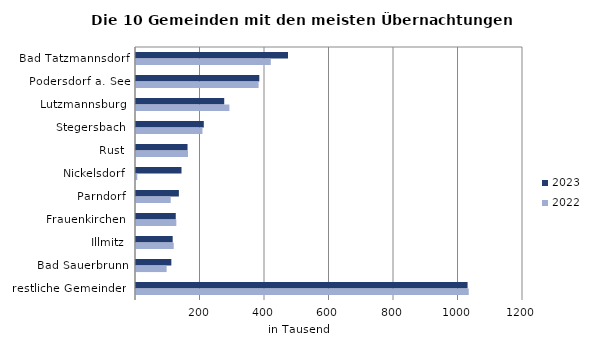
| Category | 2023 | 2022 |
|---|---|---|
| Bad Tatzmannsdorf | 471334 | 417994 |
| Podersdorf a. See | 382356 | 380185 |
| Lutzmannsburg | 273587 | 289608 |
| Stegersbach | 210259 | 206066 |
| Rust | 159813 | 161211 |
| Nickelsdorf | 141094 | 3971 |
| Parndorf | 132982 | 107616 |
| Frauenkirchen | 123295 | 125028 |
| Illmitz | 113764 | 116953 |
| Bad Sauerbrunn | 109591 | 95003 |
| restliche Gemeinden | 1028169 | 1031818 |